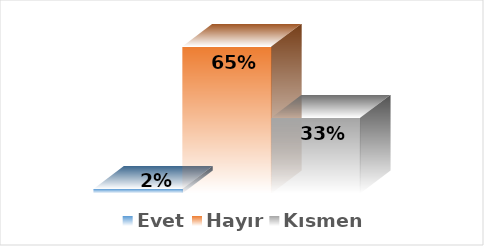
| Category | Evet | Hayır | Kısmen |
|---|---|---|---|
| 0 | 0.02 | 0.647 | 0.333 |